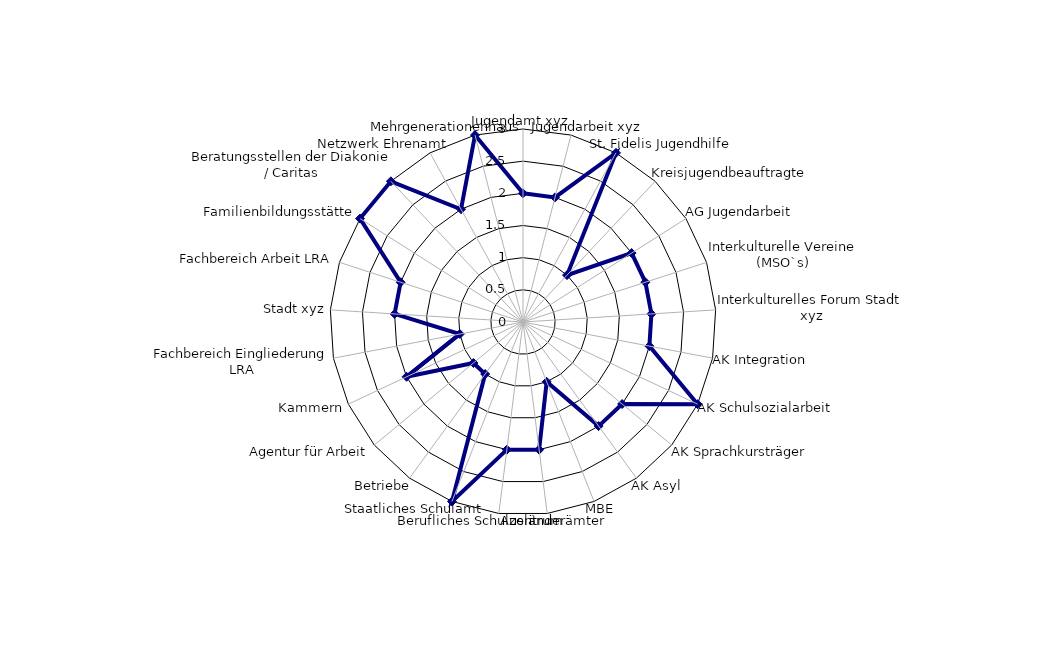
| Category | Series 0 |
|---|---|
| Jugendamt xyz | 2 |
| Jugendarbeit xyz | 2 |
| St. Fidelis Jugendhilfe | 3 |
| Kreisjugendbeauftragte | 1 |
| AG Jugendarbeit | 2 |
| Interkulturelle Vereine (MSO`s) | 2 |
| Interkulturelles Forum Stadt xyz | 2 |
| AK Integration | 2 |
| AK Schulsozialarbeit | 3 |
| AK Sprachkursträger | 2 |
| AK Asyl | 2 |
| MBE | 1 |
| Ausländerämter | 2 |
| Berufliches Schulzentrum | 2 |
| Staatliches Schulamt | 3 |
| Betriebe | 1 |
| Agentur für Arbeit | 1 |
| Kammern | 2 |
| Fachbereich Eingliederung LRA | 1 |
| Stadt xyz | 2 |
| Fachbereich Arbeit LRA | 2 |
| Familienbildungsstätte | 3 |
| Beratungsstellen der Diakonie / Caritas | 3 |
| Netzwerk Ehrenamt | 2 |
| Mehrgenerationenhaus | 3 |